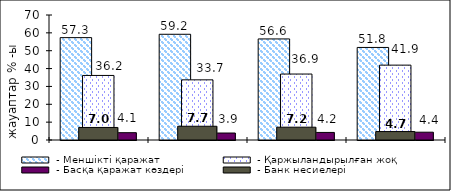
| Category |  - Меншікті қаражат |  - Қаржыландырылған жоқ  |  - Басқа қаражат көздері |
|---|---|---|---|
| 0 | 57.33 | 36.15 | 4.1 |
| 1 | 59.21 | 33.69 | 3.91 |
| 2 | 56.6 | 36.94 | 4.24 |
| 3 | 51.83 | 41.93 | 4.37 |